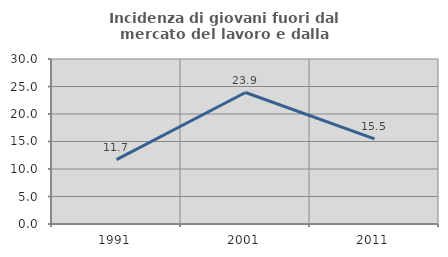
| Category | Incidenza di giovani fuori dal mercato del lavoro e dalla formazione  |
|---|---|
| 1991.0 | 11.692 |
| 2001.0 | 23.904 |
| 2011.0 | 15.493 |